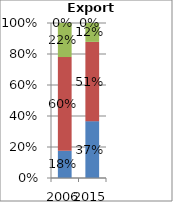
| Category | Other commercial services | Travel | Transport | Goods-related services |
|---|---|---|---|---|
| 2006.0 | 0.176 | 0.604 | 0.22 |  |
| 2015.0 | 0.367 | 0.511 | 0.122 |  |